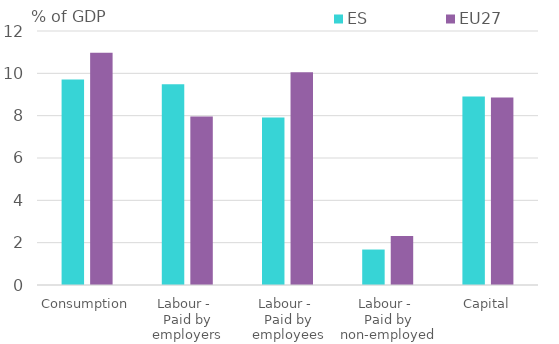
| Category | ES | EU27 |
|---|---|---|
| Consumption | 9.71 | 10.967 |
| Labour - 
Paid by employers | 9.48 | 7.966 |
| Labour - 
Paid by employees | 7.917 | 10.052 |
| Labour - 
Paid by non-employed | 1.676 | 2.311 |
| Capital | 8.903 | 8.858 |